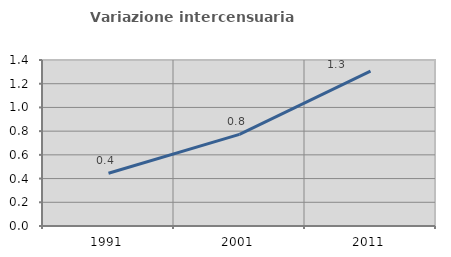
| Category | Variazione intercensuaria annua |
|---|---|
| 1991.0 | 0.445 |
| 2001.0 | 0.773 |
| 2011.0 | 1.305 |